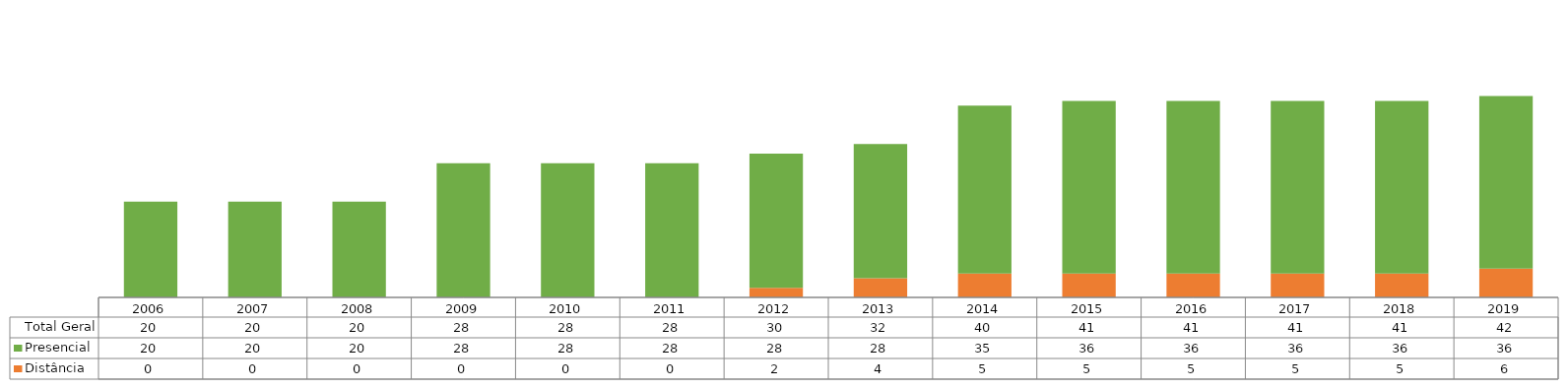
| Category | Distância | Presencial | Total Geral |
|---|---|---|---|
| 2006.0 | 0 | 20 | 20 |
| 2007.0 | 0 | 20 | 20 |
| 2008.0 | 0 | 20 | 20 |
| 2009.0 | 0 | 28 | 28 |
| 2010.0 | 0 | 28 | 28 |
| 2011.0 | 0 | 28 | 28 |
| 2012.0 | 2 | 28 | 30 |
| 2013.0 | 4 | 28 | 32 |
| 2014.0 | 5 | 35 | 40 |
| 2015.0 | 5 | 36 | 41 |
| 2016.0 | 5 | 36 | 41 |
| 2017.0 | 5 | 36 | 41 |
| 2018.0 | 5 | 36 | 41 |
| 2019.0 | 6 | 36 | 42 |